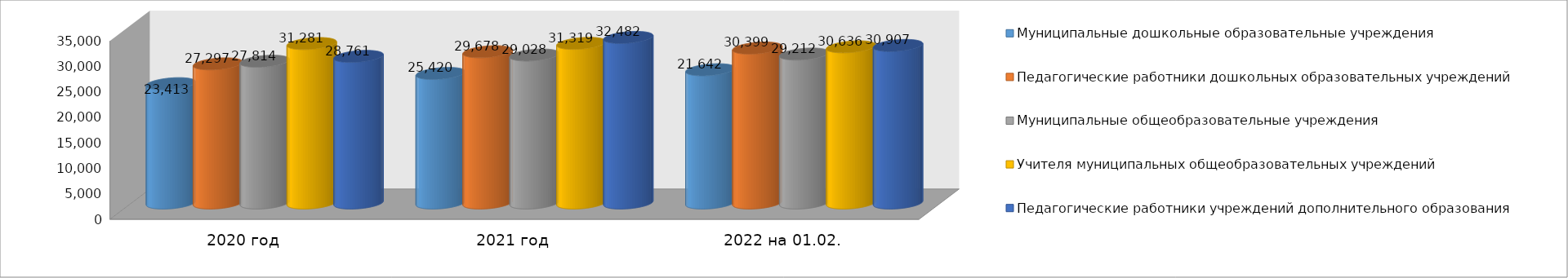
| Category | Муниципальные дошкольные образовательные учреждения | Педагогические работники дошкольных образовательных учреждений | Муниципальные общеобразовательные учреждения | Учителя муниципальных общеобразовательных учреждений | Педагогические работники учреждений дополнительного образования |
|---|---|---|---|---|---|
| 2020 год | 23413 | 27297 | 27814 | 31281 | 28761 |
| 2021 год | 25420 | 29678 | 29028 | 31319 | 32482 |
| 2022 на 01.02. | 26146 | 30399 | 29212 | 30636 | 30907 |